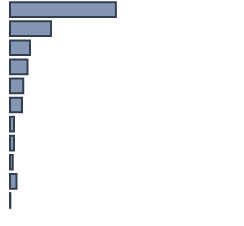
| Category | Series 0 |
|---|---|
| 0 | 46.635 |
| 1 | 18.051 |
| 2 | 8.818 |
| 3 | 7.663 |
| 4 | 5.788 |
| 5 | 5.262 |
| 6 | 1.773 |
| 7 | 1.762 |
| 8 | 1.205 |
| 9 | 2.881 |
| 10 | 0.16 |